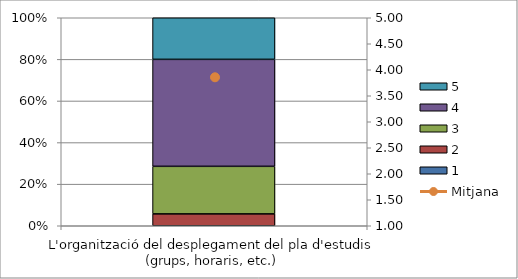
| Category | 1 | 2 | 3 | 4 | 5 |
|---|---|---|---|---|---|
| L'organització del desplegament del pla d'estudis (grups, horaris, etc.) | 0 | 2 | 8 | 18 | 7 |